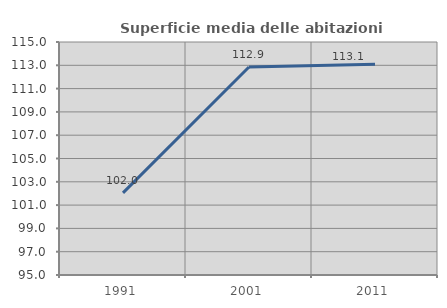
| Category | Superficie media delle abitazioni occupate |
|---|---|
| 1991.0 | 102.048 |
| 2001.0 | 112.853 |
| 2011.0 | 113.092 |